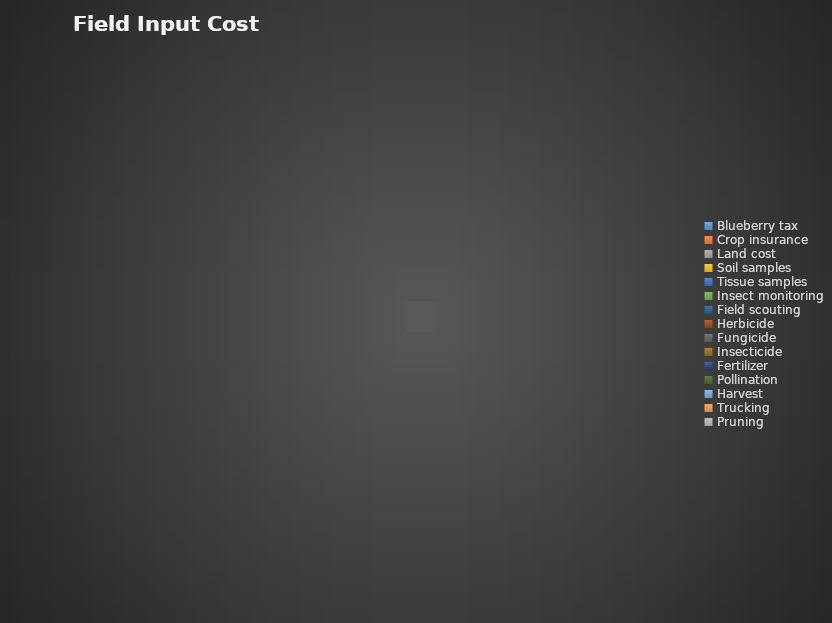
| Category | Series 0 |
|---|---|
| Blueberry tax | 0 |
| Crop insurance | 0 |
| Land cost | 0 |
| Soil samples | 0 |
| Tissue samples | 0 |
| Insect monitoring | 0 |
| Field scouting | 0 |
| Herbicide | 0 |
| Fungicide | 0 |
| Insecticide | 0 |
| Fertilizer | 0 |
| Pollination | 0 |
| Harvest | 0 |
| Trucking | 0 |
| Pruning | 0 |